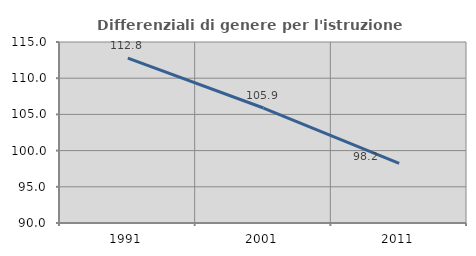
| Category | Differenziali di genere per l'istruzione superiore |
|---|---|
| 1991.0 | 112.786 |
| 2001.0 | 105.882 |
| 2011.0 | 98.222 |